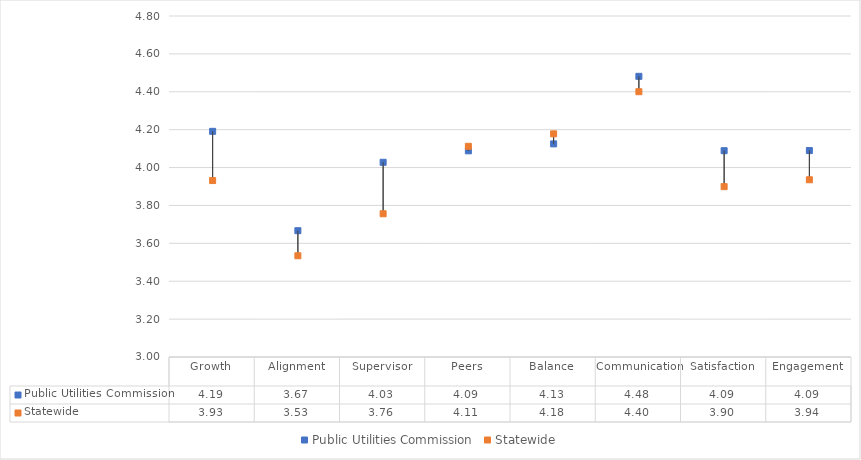
| Category | Public Utilities Commission | Statewide |
|---|---|---|
| Growth | 4.191 | 3.931 |
| Alignment | 3.667 | 3.534 |
| Supervisor | 4.028 | 3.756 |
| Peers | 4.088 | 4.112 |
| Balance | 4.125 | 4.178 |
| Communication | 4.481 | 4.4 |
| Satisfaction | 4.089 | 3.899 |
| Engagement | 4.09 | 3.936 |